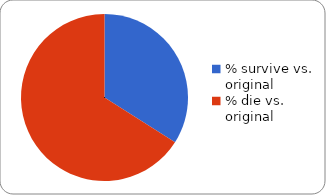
| Category | Series 2 | Series 3 | Series 1 | Series 0 |
|---|---|---|---|---|
| % survive vs. original | 0.34 | 0.34 | 0.34 | 0.34 |
| % die vs. original | 0.66 | 0.66 | 0.66 | 0.66 |